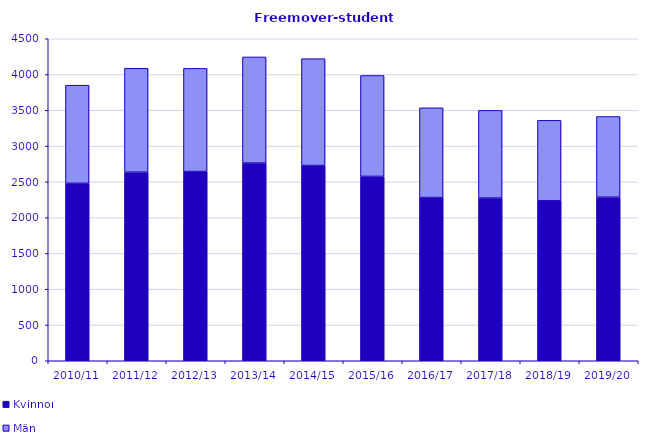
| Category | Kvinnor | Män |
|---|---|---|
| 2010/11 | 2479 | 1372 |
| 2011/12 | 2635 | 1453 |
| 2012/13 | 2644 | 1442 |
| 2013/14 | 2762 | 1484 |
| 2014/15 | 2728 | 1494 |
| 2015/16 | 2576 | 1411 |
| 2016/17 | 2281 | 1254 |
| 2017/18 | 2273 | 1226 |
| 2018/19 | 2235 | 1125 |
| 2019/20 | 2285 | 1128 |